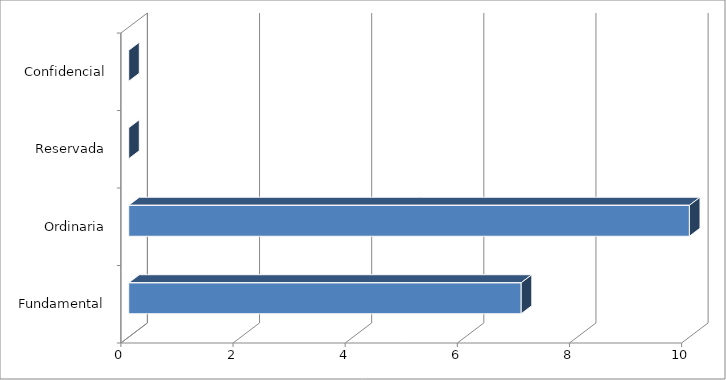
| Category | Series 0 |
|---|---|
| 0 | 7 |
| 1 | 10 |
| 2 | 0 |
| 3 | 0 |